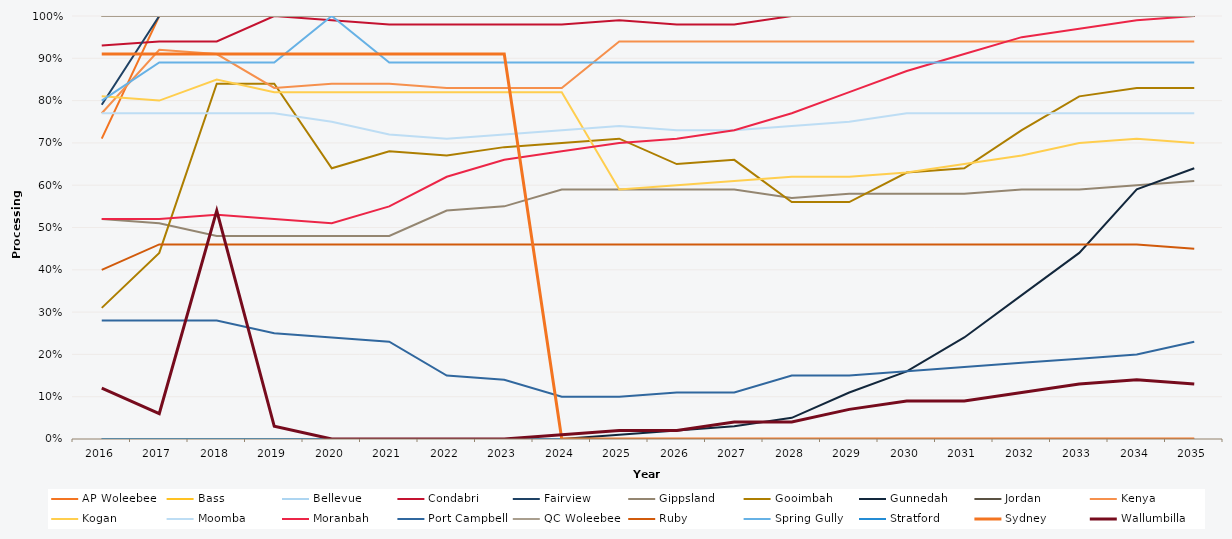
| Category | AP Woleebee | Bass | Bellevue | Condabri | Fairview | Gippsland | Gooimbah | Gunnedah | Jordan | Kenya | Kogan | Moomba | Moranbah | Port Campbell | QC Woleebee | Ruby | Spring Gully | Stratford | Sydney | Wallumbilla |
|---|---|---|---|---|---|---|---|---|---|---|---|---|---|---|---|---|---|---|---|---|
| 2016.0 | 0.71 | 1 | 1 | 0.93 | 0.79 | 0.52 | 0.31 | 0 | 1 | 0.77 | 0.81 | 0.77 | 0.52 | 0.28 | 1 | 0.4 | 0.8 | 0 | 0.91 | 0.12 |
| 2017.0 | 1 | 1 | 1 | 0.94 | 1 | 0.51 | 0.44 | 0 | 1 | 0.92 | 0.8 | 0.77 | 0.52 | 0.28 | 1 | 0.46 | 0.89 | 0 | 0.91 | 0.06 |
| 2018.0 | 1 | 1 | 1 | 0.94 | 1 | 0.48 | 0.84 | 0 | 1 | 0.91 | 0.85 | 0.77 | 0.53 | 0.28 | 1 | 0.46 | 0.89 | 0 | 0.91 | 0.54 |
| 2019.0 | 1 | 1 | 1 | 1 | 1 | 0.48 | 0.84 | 0 | 1 | 0.83 | 0.82 | 0.77 | 0.52 | 0.25 | 1 | 0.46 | 0.89 | 0 | 0.91 | 0.03 |
| 2020.0 | 1 | 1 | 1 | 0.99 | 1 | 0.48 | 0.64 | 0 | 1 | 0.84 | 0.82 | 0.75 | 0.51 | 0.24 | 1 | 0.46 | 1 | 0 | 0.91 | 0 |
| 2021.0 | 1 | 1 | 1 | 0.98 | 1 | 0.48 | 0.68 | 0 | 1 | 0.84 | 0.82 | 0.72 | 0.55 | 0.23 | 1 | 0.46 | 0.89 | 0 | 0.91 | 0 |
| 2022.0 | 1 | 1 | 1 | 0.98 | 1 | 0.54 | 0.67 | 0 | 1 | 0.83 | 0.82 | 0.71 | 0.62 | 0.15 | 1 | 0.46 | 0.89 | 0 | 0.91 | 0 |
| 2023.0 | 1 | 1 | 1 | 0.98 | 1 | 0.55 | 0.69 | 0 | 1 | 0.83 | 0.82 | 0.72 | 0.66 | 0.14 | 1 | 0.46 | 0.89 | 0 | 0.91 | 0 |
| 2024.0 | 1 | 1 | 1 | 0.98 | 1 | 0.59 | 0.7 | 0 | 1 | 0.83 | 0.82 | 0.73 | 0.68 | 0.1 | 1 | 0.46 | 0.89 | 0 | 0 | 0.01 |
| 2025.0 | 1 | 1 | 1 | 0.99 | 1 | 0.59 | 0.71 | 0.01 | 1 | 0.94 | 0.59 | 0.74 | 0.7 | 0.1 | 1 | 0.46 | 0.89 | 0 | 0 | 0.02 |
| 2026.0 | 1 | 1 | 1 | 0.98 | 1 | 0.59 | 0.65 | 0.02 | 1 | 0.94 | 0.6 | 0.73 | 0.71 | 0.11 | 1 | 0.46 | 0.89 | 0 | 0 | 0.02 |
| 2027.0 | 1 | 1 | 1 | 0.98 | 1 | 0.59 | 0.66 | 0.03 | 1 | 0.94 | 0.61 | 0.73 | 0.73 | 0.11 | 1 | 0.46 | 0.89 | 0 | 0 | 0.04 |
| 2028.0 | 1 | 1 | 1 | 1 | 1 | 0.57 | 0.56 | 0.05 | 1 | 0.94 | 0.62 | 0.74 | 0.77 | 0.15 | 1 | 0.46 | 0.89 | 0 | 0 | 0.04 |
| 2029.0 | 1 | 1 | 1 | 1 | 1 | 0.58 | 0.56 | 0.11 | 1 | 0.94 | 0.62 | 0.75 | 0.82 | 0.15 | 1 | 0.46 | 0.89 | 0 | 0 | 0.07 |
| 2030.0 | 1 | 1 | 1 | 1 | 1 | 0.58 | 0.63 | 0.16 | 1 | 0.94 | 0.63 | 0.77 | 0.87 | 0.16 | 1 | 0.46 | 0.89 | 0 | 0 | 0.09 |
| 2031.0 | 1 | 1 | 1 | 1 | 1 | 0.58 | 0.64 | 0.24 | 1 | 0.94 | 0.65 | 0.77 | 0.91 | 0.17 | 1 | 0.46 | 0.89 | 0 | 0 | 0.09 |
| 2032.0 | 1 | 1 | 1 | 1 | 1 | 0.59 | 0.73 | 0.34 | 1 | 0.94 | 0.67 | 0.77 | 0.95 | 0.18 | 1 | 0.46 | 0.89 | 0 | 0 | 0.11 |
| 2033.0 | 1 | 1 | 1 | 1 | 1 | 0.59 | 0.81 | 0.44 | 1 | 0.94 | 0.7 | 0.77 | 0.97 | 0.19 | 1 | 0.46 | 0.89 | 0 | 0 | 0.13 |
| 2034.0 | 1 | 1 | 1 | 1 | 1 | 0.6 | 0.83 | 0.59 | 1 | 0.94 | 0.71 | 0.77 | 0.99 | 0.2 | 1 | 0.46 | 0.89 | 0 | 0 | 0.14 |
| 2035.0 | 1 | 1 | 1 | 1 | 1 | 0.61 | 0.83 | 0.64 | 1 | 0.94 | 0.7 | 0.77 | 1 | 0.23 | 1 | 0.45 | 0.89 | 0 | 0 | 0.13 |